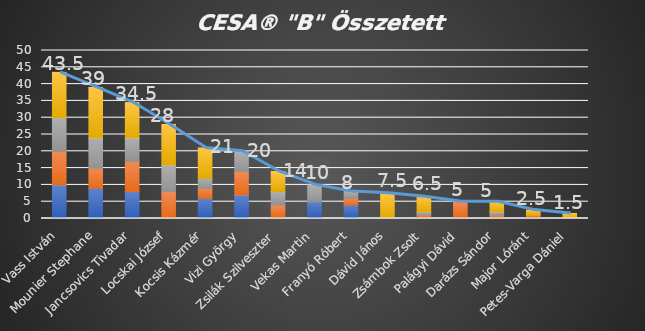
| Category | 1. liga | 2. liga | 3. liga | 4. liga |
|---|---|---|---|---|
| Vass István | 10 | 10 | 10 | 13.5 |
| Mounier Stephane | 9 | 6 | 9 | 15 |
| Jancsovics Tivadar | 8 | 9 | 7 | 10.5 |
| Locskai József | 0 | 8 | 8 | 12 |
| Kocsis Kázmér | 6 | 3 | 3 | 9 |
| Vizi György | 7 | 7 | 6 | 0 |
| Zsilák Szilveszter | 0 | 4 | 4 | 6 |
| Vekas Martin | 5 | 0 | 5 | 0 |
| Franyó Róbert | 4 | 2 | 2 | 0 |
| Dávid János | 0 | 0 | 0 | 7.5 |
| Zsámbok Zsolt | 0 | 1 | 1 | 4.5 |
| Palágyi Dávid | 0 | 5 | 0 | 0 |
| Darázs Sándor | 0 | 1 | 1 | 3 |
| Major Lóránt | 0 | 1 | 0 | 1.5 |
| Petes-Varga Dániel | 0 | 0 | 0 | 1.5 |